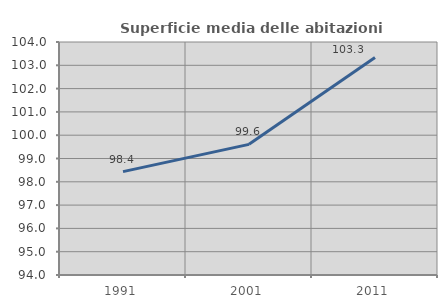
| Category | Superficie media delle abitazioni occupate |
|---|---|
| 1991.0 | 98.438 |
| 2001.0 | 99.607 |
| 2011.0 | 103.339 |